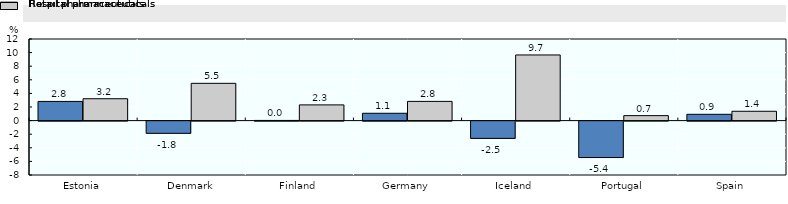
| Category | Retail pharmaceuticals | Hospital pharmaceuticals |
|---|---|---|
| Estonia | 2.82 | 3.217 |
| Denmark | -1.797 | 5.481 |
| Finland | 0.025 | 2.312 |
| Germany | 1.078 | 2.824 |
| Iceland | -2.544 | 9.652 |
| Portugal | -5.358 | 0.732 |
| Spain | 0.926 | 1.371 |